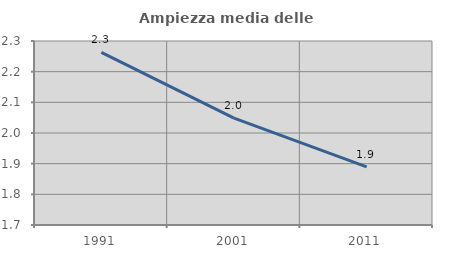
| Category | Ampiezza media delle famiglie |
|---|---|
| 1991.0 | 2.263 |
| 2001.0 | 2.048 |
| 2011.0 | 1.889 |